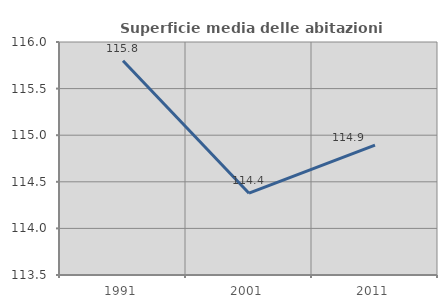
| Category | Superficie media delle abitazioni occupate |
|---|---|
| 1991.0 | 115.799 |
| 2001.0 | 114.378 |
| 2011.0 | 114.894 |